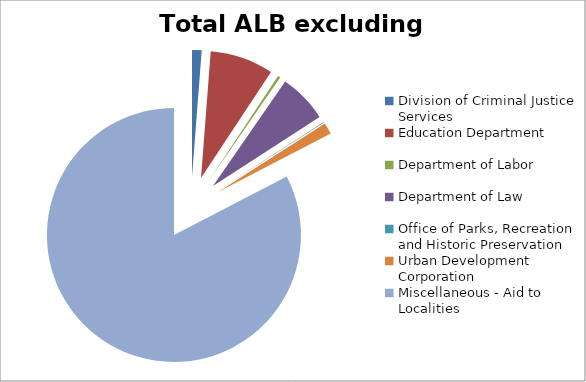
| Category | Series 0 |
|---|---|
| Division of Criminal Justice Services | 15989000 |
| Education Department | 105681000 |
| Department of Labor | 4355500 |
| Department of Law | 81500234 |
| Office of Parks, Recreation and Historic Preservation | 1000000 |
| Urban Development Corporation | 19000000 |
| Miscellaneous - Aid to Localities | 1081754736 |